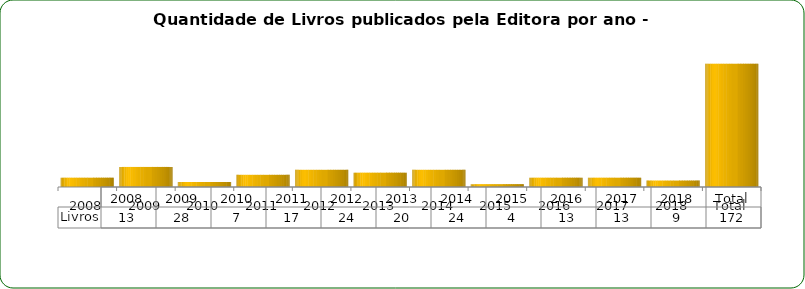
| Category | Livros |
|---|---|
| 2008 | 13 |
| 2009 | 28 |
| 2010 | 7 |
| 2011 | 17 |
| 2012 | 24 |
| 2013 | 20 |
| 2014 | 24 |
| 2015 | 4 |
| 2016 | 13 |
| 2017 | 13 |
| 2018 | 9 |
| Total | 172 |